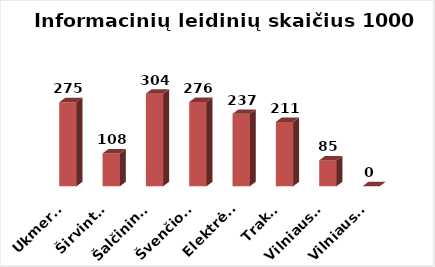
| Category | Series 0 |
|---|---|
| Ukmergė | 275.171 |
| Širvintos | 107.522 |
| Šalčininkai | 303.535 |
| Švenčionys | 275.864 |
| Elektrėnai | 237.219 |
| Trakai | 210.947 |
| Vilniaus r. | 84.596 |
| Vilniaus m. | 0 |